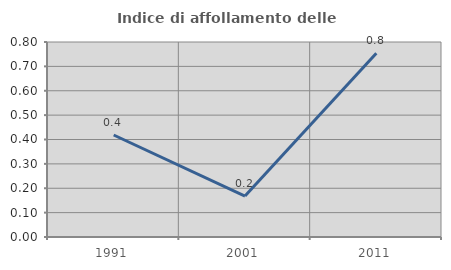
| Category | Indice di affollamento delle abitazioni  |
|---|---|
| 1991.0 | 0.418 |
| 2001.0 | 0.168 |
| 2011.0 | 0.753 |